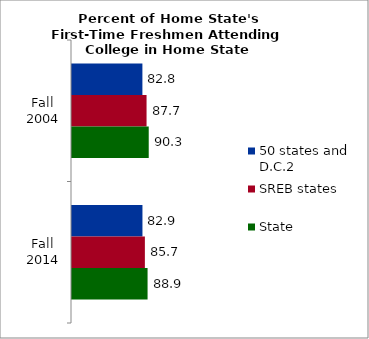
| Category | 50 states and D.C.2 | SREB states | State |
|---|---|---|---|
| Fall 2004 | 82.827 | 87.715 | 90.268 |
| Fall 2014 | 82.888 | 85.739 | 88.906 |